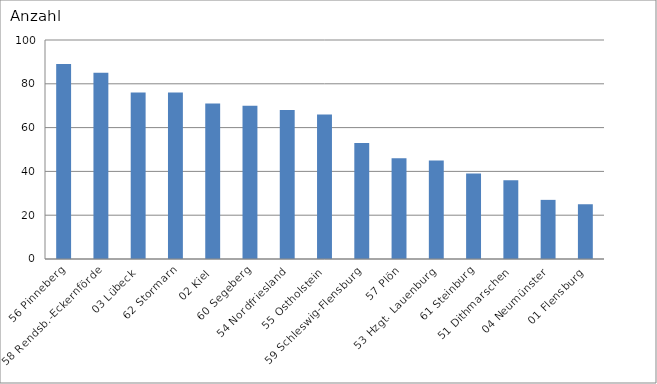
| Category | 56 Pinneberg |
|---|---|
| 56 Pinneberg | 89 |
| 58 Rendsb.-Eckernförde | 85 |
| 03 Lübeck | 76 |
| 62 Stormarn | 76 |
| 02 Kiel | 71 |
| 60 Segeberg | 70 |
| 54 Nordfriesland | 68 |
| 55 Ostholstein | 66 |
| 59 Schleswig-Flensburg | 53 |
| 57 Plön | 46 |
| 53 Hzgt. Lauenburg | 45 |
| 61 Steinburg | 39 |
| 51 Dithmarschen | 36 |
| 04 Neumünster | 27 |
| 01 Flensburg | 25 |